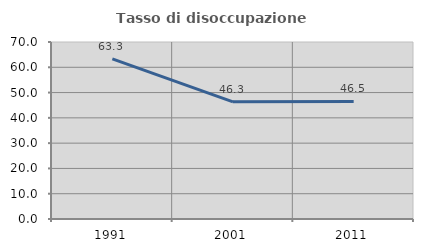
| Category | Tasso di disoccupazione giovanile  |
|---|---|
| 1991.0 | 63.341 |
| 2001.0 | 46.333 |
| 2011.0 | 46.5 |